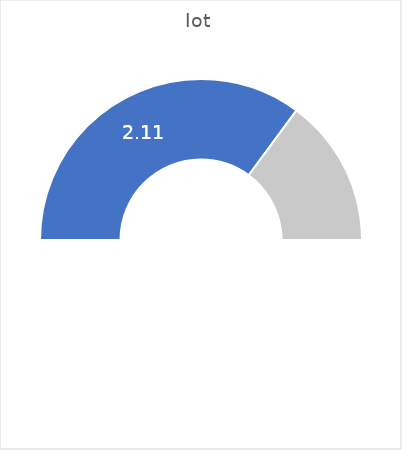
| Category | Series 0 |
|---|---|
| 0 | 0.702 |
| 1 | 0.298 |
| 2 | 1 |